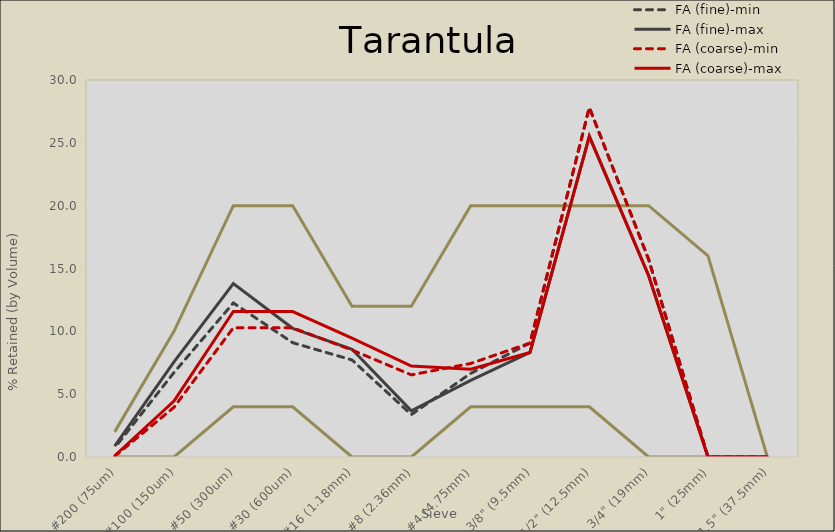
| Category | FA (fine)-min | Min | Max | FA (fine)-max | FA (coarse)-min | FA (coarse)-max |
|---|---|---|---|---|---|---|
| 1.5" (37.5mm) | 0 | 0 | 0 | 0 | 0 | 0 |
| 1" (25mm) | 0 | 0 | 16 | 0 | 0 | 0 |
| 3/4" (19mm) | 15.719 | 0 | 20 | 14.422 | 15.719 | 14.422 |
| 1/2" (12.5mm) | 27.81 | 4 | 20 | 25.517 | 27.81 | 25.517 |
| 3/8" (9.5mm) | 9.068 | 4 | 20 | 8.321 | 9.068 | 8.321 |
| #4 (4.75mm) | 6.65 | 4 | 20 | 6.102 | 7.441 | 6.992 |
| #8 (2.36mm) | 3.373 | 0 | 12 | 3.672 | 6.536 | 7.234 |
| #16 (1.18mm) | 7.722 | 0 | 12 | 8.57 | 8.513 | 9.461 |
| #30 (600um) | 9.095 | 4 | 20 | 10.242 | 10.281 | 11.578 |
| #50 (300um) | 12.259 | 4 | 20 | 13.804 | 10.281 | 11.578 |
| #100 (150um) | 6.722 | 0 | 10 | 7.57 | 3.954 | 4.453 |
| #200 (75um) | 0.728 | 0 | 2 | 0.858 | 0.056 | 0.101 |